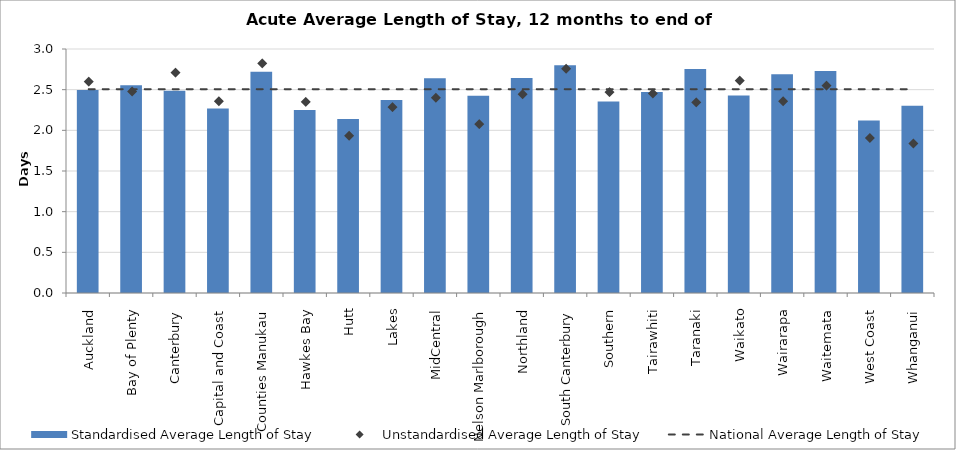
| Category | Standardised Average Length of Stay |
|---|---|
| Auckland | 2.495 |
| Bay of Plenty | 2.554 |
| Canterbury | 2.488 |
| Capital and Coast | 2.267 |
| Counties Manukau | 2.721 |
| Hawkes Bay | 2.249 |
| Hutt | 2.14 |
| Lakes | 2.373 |
| MidCentral | 2.639 |
| Nelson Marlborough | 2.426 |
| Northland | 2.645 |
| South Canterbury | 2.8 |
| Southern | 2.354 |
| Tairawhiti | 2.471 |
| Taranaki | 2.753 |
| Waikato | 2.427 |
| Wairarapa | 2.691 |
| Waitemata | 2.729 |
| West Coast | 2.12 |
| Whanganui | 2.302 |